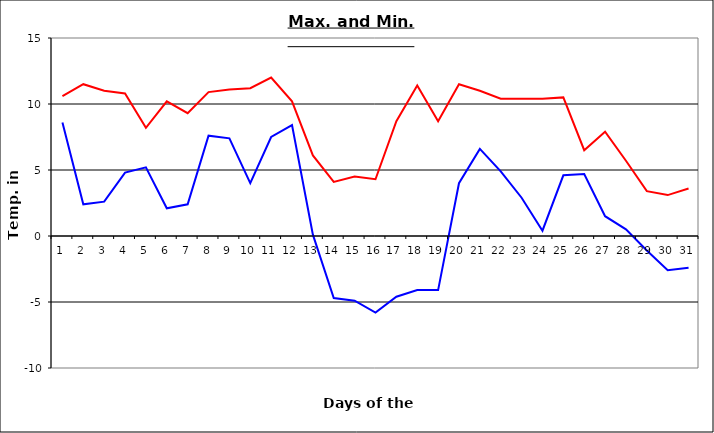
| Category | Series 0 | Series 1 |
|---|---|---|
| 0 | 10.6 | 8.6 |
| 1 | 11.5 | 2.4 |
| 2 | 11 | 2.6 |
| 3 | 10.8 | 4.8 |
| 4 | 8.2 | 5.2 |
| 5 | 10.2 | 2.1 |
| 6 | 9.3 | 2.4 |
| 7 | 10.9 | 7.6 |
| 8 | 11.1 | 7.4 |
| 9 | 11.2 | 4 |
| 10 | 12 | 7.5 |
| 11 | 10.2 | 8.4 |
| 12 | 6.1 | 0.1 |
| 13 | 4.1 | -4.7 |
| 14 | 4.5 | -4.9 |
| 15 | 4.3 | -5.8 |
| 16 | 8.7 | -4.6 |
| 17 | 11.4 | -4.1 |
| 18 | 8.7 | -4.1 |
| 19 | 11.5 | 4 |
| 20 | 11 | 6.6 |
| 21 | 10.4 | 4.9 |
| 22 | 10.4 | 2.9 |
| 23 | 10.4 | 0.4 |
| 24 | 10.5 | 4.6 |
| 25 | 6.5 | 4.7 |
| 26 | 7.9 | 1.5 |
| 27 | 5.7 | 0.5 |
| 28 | 3.4 | -1.1 |
| 29 | 3.1 | -2.6 |
| 30 | 3.6 | -2.4 |